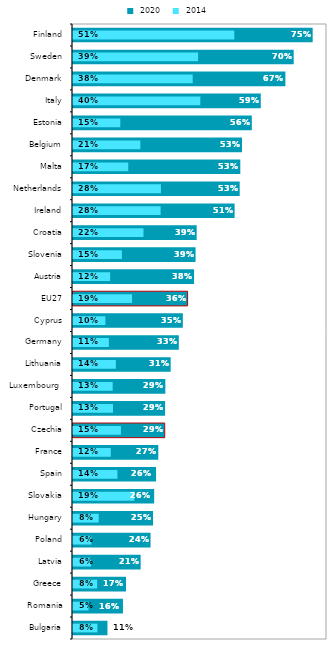
| Category |  2020 |
|---|---|
| Bulgaria | 0.109 |
| Romania | 0.157 |
| Greece | 0.167 |
| Latvia | 0.213 |
| Poland | 0.244 |
| Hungary | 0.252 |
| Slovakia | 0.256 |
| Spain | 0.262 |
| France | 0.269 |
| Czechia | 0.289 |
| Portugal | 0.29 |
| Luxembourg  | 0.291 |
| Lithuania | 0.308 |
| Germany | 0.333 |
| Cyprus | 0.346 |
| EU27 | 0.361 |
| Austria | 0.381 |
| Slovenia | 0.386 |
| Croatia | 0.39 |
| Ireland | 0.509 |
| Netherlands | 0.525 |
| Malta | 0.527 |
| Belgium | 0.532 |
| Estonia | 0.563 |
| Italy | 0.591 |
| Denmark | 0.669 |
| Sweden | 0.695 |
| Finland | 0.755 |